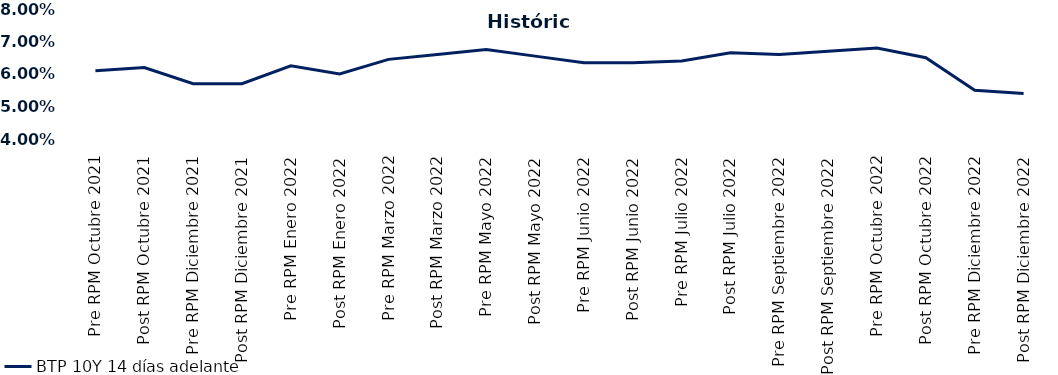
| Category | BTP 10Y 14 días adelante |
|---|---|
| Pre RPM Octubre 2021 | 0.061 |
| Post RPM Octubre 2021 | 0.062 |
| Pre RPM Diciembre 2021 | 0.057 |
| Post RPM Diciembre 2021 | 0.057 |
| Pre RPM Enero 2022 | 0.062 |
| Post RPM Enero 2022 | 0.06 |
| Pre RPM Marzo 2022 | 0.064 |
| Post RPM Marzo 2022 | 0.066 |
| Pre RPM Mayo 2022 | 0.068 |
| Post RPM Mayo 2022 | 0.066 |
| Pre RPM Junio 2022 | 0.064 |
| Post RPM Junio 2022 | 0.064 |
| Pre RPM Julio 2022 | 0.064 |
| Post RPM Julio 2022 | 0.066 |
| Pre RPM Septiembre 2022 | 0.066 |
| Post RPM Septiembre 2022 | 0.067 |
| Pre RPM Octubre 2022 | 0.068 |
| Post RPM Octubre 2022 | 0.065 |
| Pre RPM Diciembre 2022 | 0.055 |
| Post RPM Diciembre 2022 | 0.054 |